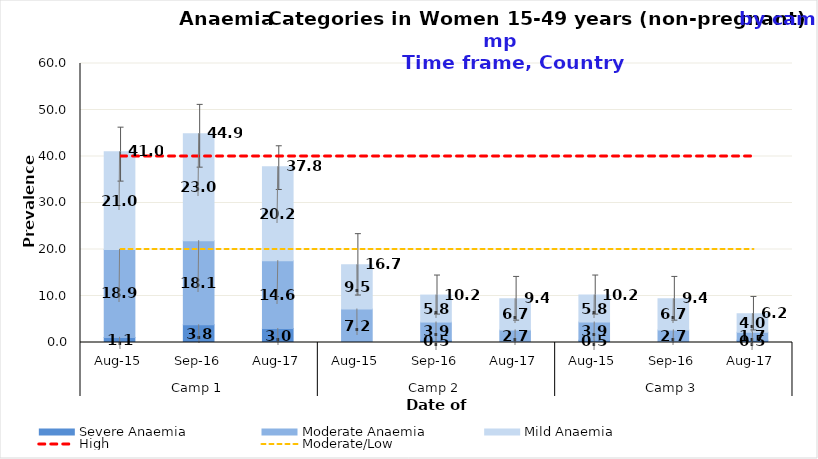
| Category | Severe Anaemia | Moderate Anaemia | Mild Anaemia |
|---|---|---|---|
| 0 | 1.1 | 18.9 | 21 |
| 1 | 3.8 | 18.1 | 23 |
| 2 | 3 | 14.6 | 20.2 |
| 3 | 0 | 7.2 | 9.5 |
| 4 | 0.5 | 3.9 | 5.8 |
| 5 | 0 | 2.7 | 6.7 |
| 6 | 0.5 | 3.9 | 5.8 |
| 7 | 0 | 2.7 | 6.7 |
| 8 | 0.5 | 1.7 | 4 |